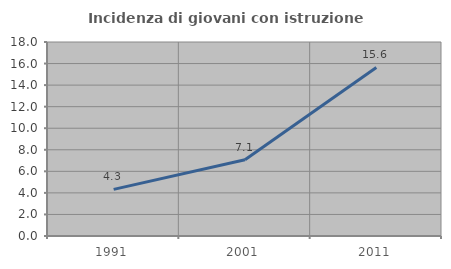
| Category | Incidenza di giovani con istruzione universitaria |
|---|---|
| 1991.0 | 4.328 |
| 2001.0 | 7.082 |
| 2011.0 | 15.638 |